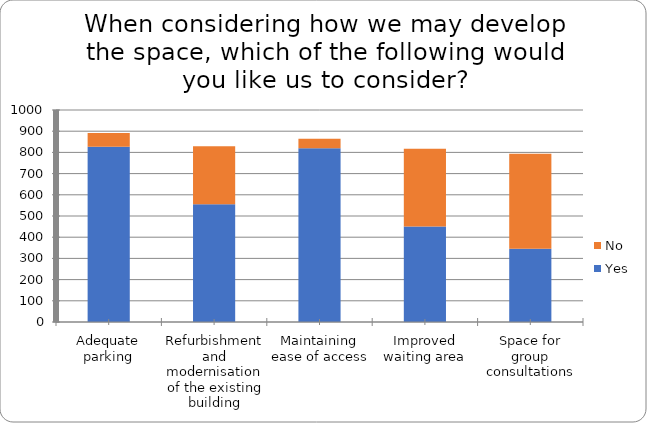
| Category | Yes | No |
|---|---|---|
| Adequate parking | 827 | 64 |
| Refurbishment and modernisation of the existing building | 555 | 274 |
| Maintaining ease of access | 819 | 45 |
| Improved waiting area | 451 | 366 |
| Space for group consultations | 346 | 448 |